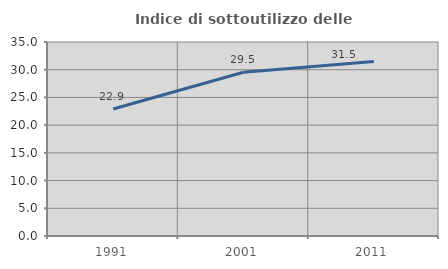
| Category | Indice di sottoutilizzo delle abitazioni  |
|---|---|
| 1991.0 | 22.921 |
| 2001.0 | 29.537 |
| 2011.0 | 31.461 |